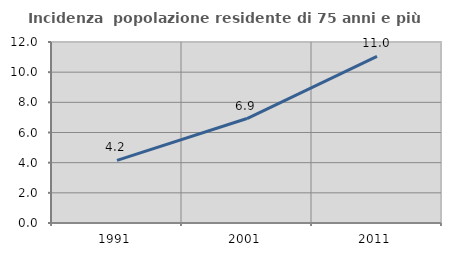
| Category | Incidenza  popolazione residente di 75 anni e più |
|---|---|
| 1991.0 | 4.155 |
| 2001.0 | 6.925 |
| 2011.0 | 11.048 |